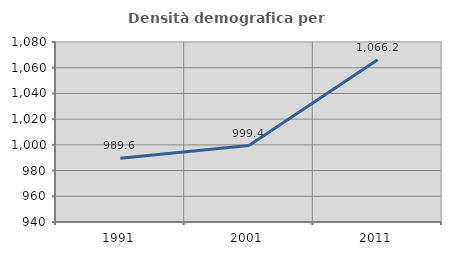
| Category | Densità demografica |
|---|---|
| 1991.0 | 989.62 |
| 2001.0 | 999.421 |
| 2011.0 | 1066.247 |